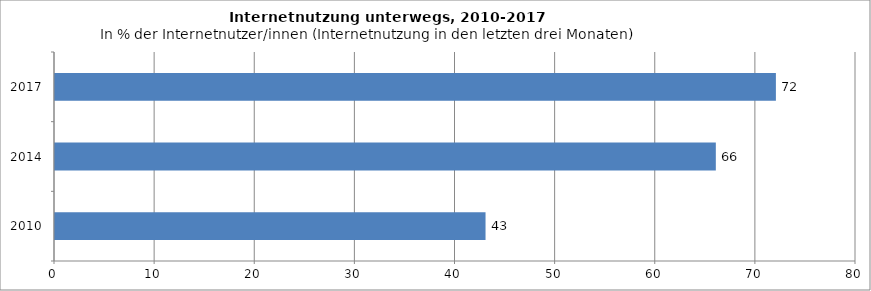
| Category | Mobile Internetnutzer/innen |
|---|---|
| 2010.0 | 43 |
| 2014.0 | 66 |
| 2017.0 | 72 |